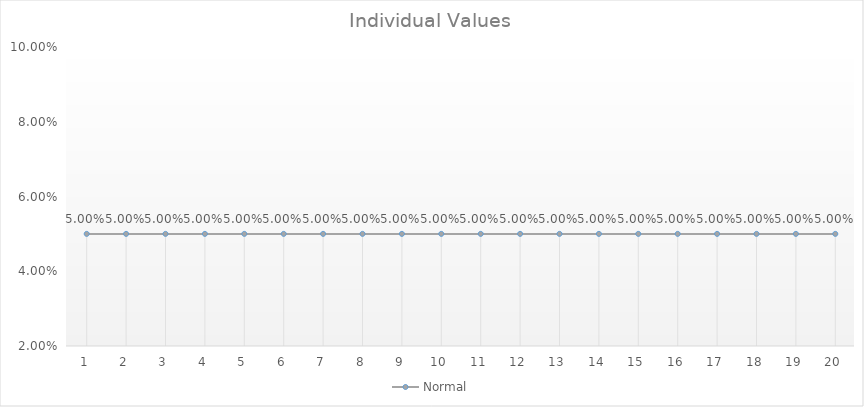
| Category | Normal |
|---|---|
| 1.0 | 0.05 |
| 2.0 | 0.05 |
| 3.0 | 0.05 |
| 4.0 | 0.05 |
| 5.0 | 0.05 |
| 6.0 | 0.05 |
| 7.0 | 0.05 |
| 8.0 | 0.05 |
| 9.0 | 0.05 |
| 10.0 | 0.05 |
| 11.0 | 0.05 |
| 12.0 | 0.05 |
| 13.0 | 0.05 |
| 14.0 | 0.05 |
| 15.0 | 0.05 |
| 16.0 | 0.05 |
| 17.0 | 0.05 |
| 18.0 | 0.05 |
| 19.0 | 0.05 |
| 20.0 | 0.05 |